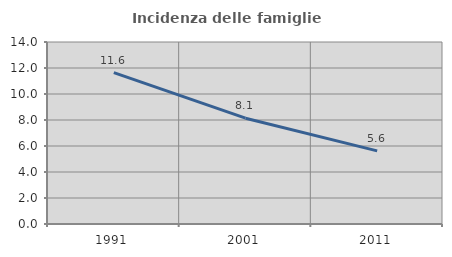
| Category | Incidenza delle famiglie numerose |
|---|---|
| 1991.0 | 11.642 |
| 2001.0 | 8.14 |
| 2011.0 | 5.624 |